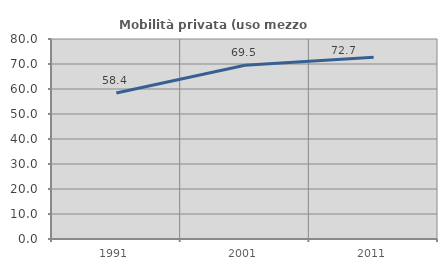
| Category | Mobilità privata (uso mezzo privato) |
|---|---|
| 1991.0 | 58.398 |
| 2001.0 | 69.516 |
| 2011.0 | 72.683 |